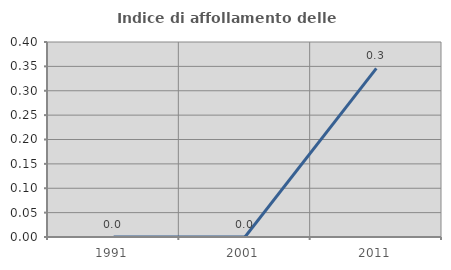
| Category | Indice di affollamento delle abitazioni  |
|---|---|
| 1991.0 | 0 |
| 2001.0 | 0 |
| 2011.0 | 0.346 |